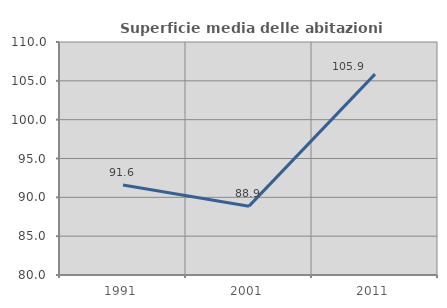
| Category | Superficie media delle abitazioni occupate |
|---|---|
| 1991.0 | 91.59 |
| 2001.0 | 88.865 |
| 2011.0 | 105.86 |